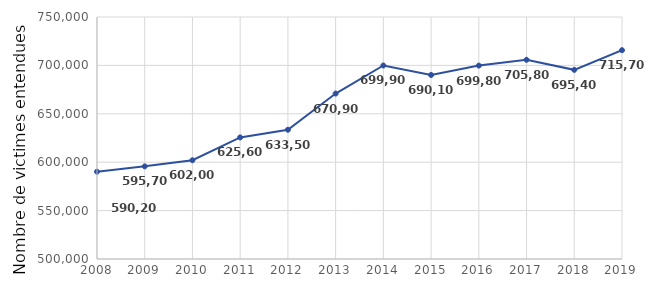
| Category | Series 0 |
|---|---|
| 2008.0 | 590200 |
| 2009.0 | 595700 |
| 2010.0 | 602000 |
| 2011.0 | 625600 |
| 2012.0 | 633500 |
| 2013.0 | 670900 |
| 2014.0 | 699900 |
| 2015.0 | 690100 |
| 2016.0 | 699800 |
| 2017.0 | 705800 |
| 2018.0 | 695400 |
| 2019.0 | 715700 |